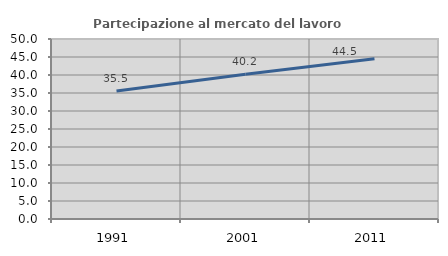
| Category | Partecipazione al mercato del lavoro  femminile |
|---|---|
| 1991.0 | 35.54 |
| 2001.0 | 40.21 |
| 2011.0 | 44.503 |